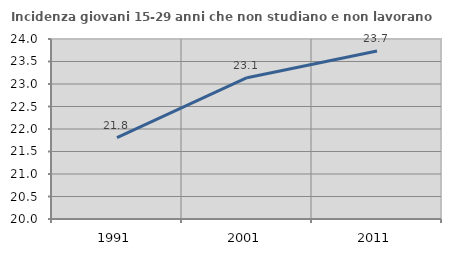
| Category | Incidenza giovani 15-29 anni che non studiano e non lavorano  |
|---|---|
| 1991.0 | 21.809 |
| 2001.0 | 23.14 |
| 2011.0 | 23.734 |